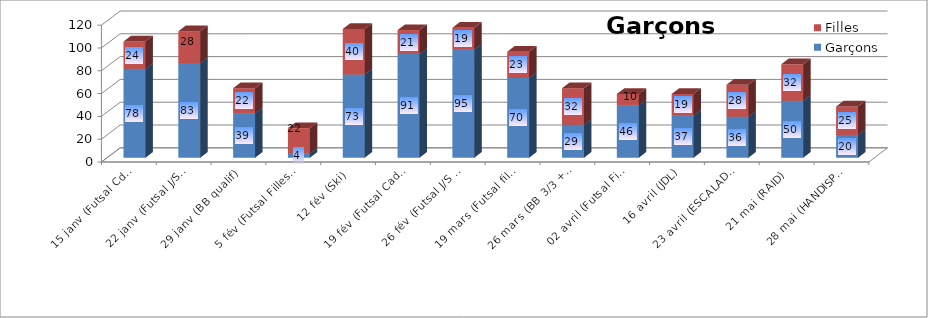
| Category | Garçons | Filles |
|---|---|---|
| 15 janv (Futsal Cdts + VB) | 78 | 24 |
| 22 janv (Futsal J/S + Bad + Escalade + Arbitrage BB) | 83 | 28 |
| 29 janv (BB qualif) | 39 | 22 |
| 5 fév (Futsal Filles + Championnats Dépt) | 4 | 22 |
| 12 fév (Ski) | 73 | 40 |
| 19 fév (Futsal Cadets 1/2 finales + Choré Collective) | 91 | 21 |
| 26 fév (Futsal J/S 1/2 finales + BB Finale LP) | 95 | 19 |
| 19 mars (Futsal filles + Cadets Finale LP + Bad de ptps) | 70 | 23 |
| 26 mars (BB 3/3 + Choré Coll + Finales Dpt Cadets) | 29 | 32 |
| 02 avril (Futsal Finale District J/S + VB) | 46 | 10 |
| 16 avril (JDL) | 37 | 19 |
| 23 avril (ESCALADE + Foot à 7) | 36 | 28 |
| 21 mai (RAID) | 50 | 32 |
| 28 mai (HANDISPORT) | 20 | 25 |